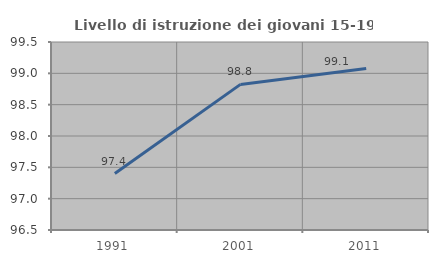
| Category | Livello di istruzione dei giovani 15-19 anni |
|---|---|
| 1991.0 | 97.401 |
| 2001.0 | 98.824 |
| 2011.0 | 99.076 |